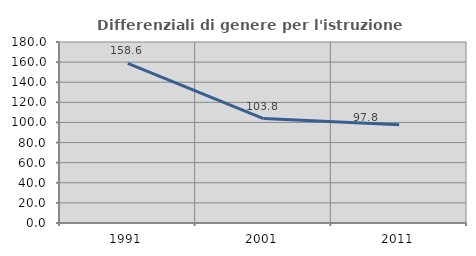
| Category | Differenziali di genere per l'istruzione superiore |
|---|---|
| 1991.0 | 158.648 |
| 2001.0 | 103.839 |
| 2011.0 | 97.787 |